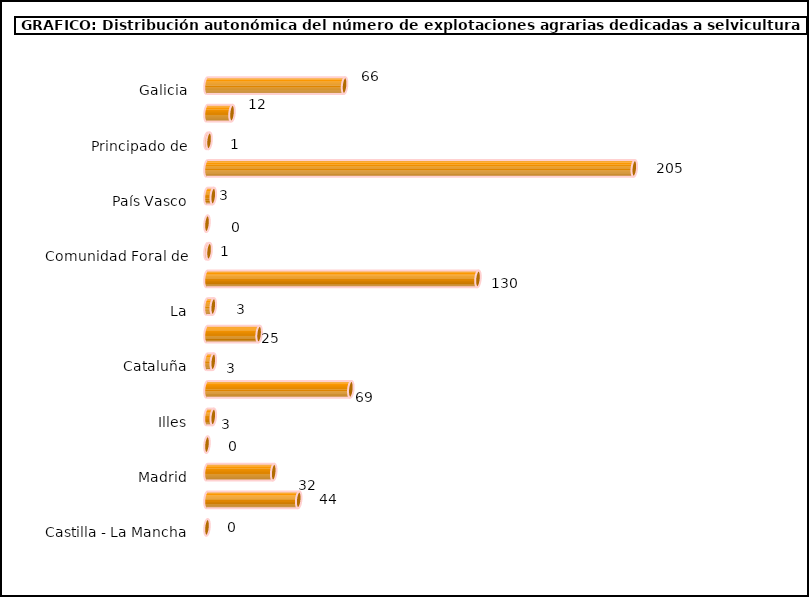
| Category | Series 0 |
|---|---|
| 0 | 66 |
| 1 | 12 |
| 2 | 1 |
| 3 | 205 |
| 4 | 3 |
| 5 | 0 |
| 6 | 1 |
| 7 | 130 |
| 8 | 3 |
| 9 | 25 |
| 10 | 3 |
| 11 | 69 |
| 12 | 3 |
| 13 | 0 |
| 14 | 32 |
| 15 | 44 |
| 16 | 0 |